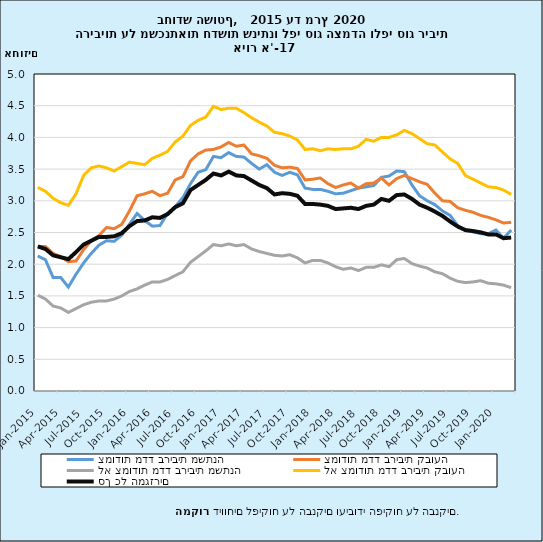
| Category | צמודות מדד בריבית משתנה | צמודות מדד בריבית קבועה | לא צמודות מדד בריבית משתנה | לא צמודות מדד בריבית קבועה | סך כל המגזרים |
|---|---|---|---|---|---|
| 2015-01-31 | 2.13 | 2.28 | 1.51 | 3.21 | 2.28 |
| 2015-02-28 | 2.07 | 2.28 | 1.45 | 3.15 | 2.24 |
| 2015-03-31 | 1.79 | 2.17 | 1.34 | 3.04 | 2.14 |
| 2015-04-30 | 1.79 | 2.12 | 1.31 | 2.97 | 2.11 |
| 2015-05-31 | 1.64 | 2.04 | 1.24 | 2.93 | 2.08 |
| 2015-06-30 | 1.84 | 2.05 | 1.3 | 3.11 | 2.19 |
| 2015-07-31 | 2.02 | 2.23 | 1.36 | 3.4 | 2.31 |
| 2015-08-31 | 2.17 | 2.37 | 1.4 | 3.52 | 2.37 |
| 2015-09-30 | 2.3 | 2.45 | 1.42 | 3.55 | 2.43 |
| 2015-10-31 | 2.37 | 2.58 | 1.42 | 3.52 | 2.43 |
| 2015-11-30 | 2.36 | 2.56 | 1.45 | 3.47 | 2.44 |
| 2015-12-31 | 2.46 | 2.63 | 1.5 | 3.54 | 2.49 |
| 2016-01-31 | 2.63 | 2.84 | 1.57 | 3.61 | 2.6 |
| 2016-02-29 | 2.8 | 3.08 | 1.61 | 3.59 | 2.68 |
| 2016-03-31 | 2.69 | 3.11 | 1.67 | 3.57 | 2.69 |
| 2016-04-30 | 2.6 | 3.15 | 1.72 | 3.67 | 2.74 |
| 2016-05-31 | 2.61 | 3.08 | 1.72 | 3.72 | 2.73 |
| 2016-06-30 | 2.8 | 3.12 | 1.76 | 3.78 | 2.79 |
| 2016-07-31 | 2.91 | 3.33 | 1.82 | 3.93 | 2.9 |
| 2016-08-31 | 3.05 | 3.38 | 1.88 | 4.02 | 2.96 |
| 2016-09-30 | 3.27 | 3.63 | 2.03 | 4.19 | 3.17 |
| 2016-10-31 | 3.45 | 3.74 | 2.12 | 4.27 | 3.25 |
| 2016-11-30 | 3.49 | 3.8 | 2.21 | 4.32 | 3.33 |
| 2016-12-31 | 3.7 | 3.81 | 2.31 | 4.49 | 3.43 |
| 2017-01-31 | 3.68 | 3.85 | 2.29 | 4.44 | 3.4 |
| 2017-02-28 | 3.76 | 3.92 | 2.32 | 4.46 | 3.46 |
| 2017-03-31 | 3.7 | 3.86 | 2.29 | 4.46 | 3.4 |
| 2017-04-30 | 3.69 | 3.88 | 2.31 | 4.39 | 3.39 |
| 2017-05-31 | 3.59 | 3.74 | 2.24 | 4.31 | 3.32 |
| 2017-06-30 | 3.5 | 3.71 | 2.2 | 4.24 | 3.25 |
| 2017-07-31 | 3.57 | 3.67 | 2.17 | 4.18 | 3.2 |
| 2017-08-31 | 3.45 | 3.56 | 2.14 | 4.08 | 3.1 |
| 2017-09-30 | 3.4 | 3.52 | 2.13 | 4.06 | 3.12 |
| 2017-10-31 | 3.45 | 3.53 | 2.15 | 4.02 | 3.11 |
| 2017-11-30 | 3.41 | 3.51 | 2.1 | 3.96 | 3.08 |
| 2017-12-31 | 3.2 | 3.33 | 2.02 | 3.81 | 2.95 |
| 2018-01-31 | 3.18 | 3.34 | 2.06 | 3.82 | 2.95 |
| 2018-02-28 | 3.18 | 3.36 | 2.06 | 3.79 | 2.94 |
| 2018-03-31 | 3.15 | 3.27 | 2.02 | 3.82 | 2.92 |
| 2018-04-30 | 3.11 | 3.21 | 1.96 | 3.81 | 2.87 |
| 2018-05-31 | 3.12 | 3.25 | 1.92 | 3.82 | 2.88 |
| 2018-06-30 | 3.16 | 3.28 | 1.94 | 3.82 | 2.89 |
| 2018-07-31 | 3.2 | 3.2 | 1.9 | 3.86 | 2.87 |
| 2018-08-31 | 3.22 | 3.27 | 1.95 | 3.97 | 2.92 |
| 2018-09-30 | 3.24 | 3.28 | 1.95 | 3.94 | 2.94 |
| 2018-10-31 | 3.37 | 3.36 | 1.99 | 4 | 3.03 |
| 2018-11-30 | 3.39 | 3.25 | 1.96 | 4 | 3 |
| 2018-12-31 | 3.47 | 3.35 | 2.07 | 4.04 | 3.09 |
| 2019-01-31 | 3.46 | 3.4 | 2.09 | 4.11 | 3.1 |
| 2019-02-28 | 3.25 | 3.35 | 2.01 | 4.06 | 3.03 |
| 2019-03-31 | 3.08 | 3.3 | 1.97 | 3.98 | 2.94 |
| 2019-04-30 | 3 | 3.26 | 1.94 | 3.9 | 2.89 |
| 2019-05-31 | 2.94 | 3.12 | 1.88 | 3.88 | 2.83 |
| 2019-06-30 | 2.84 | 3 | 1.85 | 3.77 | 2.762 |
| 2019-07-31 | 2.77 | 2.99 | 1.78 | 3.66 | 2.673 |
| 2019-08-31 | 2.61 | 2.89 | 1.73 | 3.59 | 2.594 |
| 2019-09-30 | 2.53 | 2.85 | 1.71 | 3.4 | 2.539 |
| 2019-10-31 | 2.51 | 2.82 | 1.72 | 3.34 | 2.523 |
| 2019-11-30 | 2.48 | 2.77 | 1.74 | 3.28 | 2.503 |
| 2019-12-31 | 2.48 | 2.74 | 1.7 | 3.22 | 2.47 |
| 2020-01-31 | 2.54 | 2.7 | 1.69 | 3.21 | 2.47 |
| 2020-02-29 | 2.41 | 2.65 | 1.67 | 3.17 | 2.41 |
| 2020-03-31 | 2.54 | 2.66 | 1.63 | 3.1 | 2.42 |